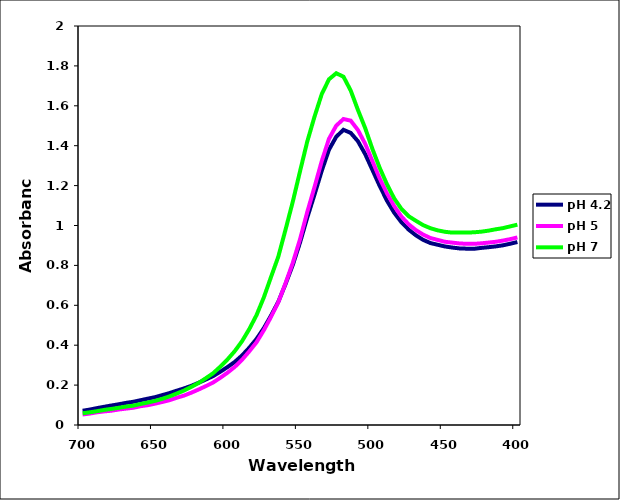
| Category | pH 4.2 | pH 5 | pH 7 |
|---|---|---|---|
| 700.0673218 | 0.071 | 0.053 | 0.059 |
| 695.0328369 | 0.077 | 0.057 | 0.064 |
| 689.9901123 | 0.085 | 0.064 | 0.069 |
| 684.93927 | 0.091 | 0.068 | 0.076 |
| 680.0249634 | 0.098 | 0.072 | 0.081 |
| 674.958252 | 0.104 | 0.078 | 0.086 |
| 670.0286865 | 0.111 | 0.082 | 0.093 |
| 664.9462891 | 0.116 | 0.086 | 0.097 |
| 660.0015869 | 0.124 | 0.094 | 0.105 |
| 655.0495605 | 0.132 | 0.099 | 0.113 |
| 649.9442139 | 0.14 | 0.107 | 0.121 |
| 644.977417 | 0.15 | 0.115 | 0.131 |
| 640.003418 | 0.16 | 0.124 | 0.144 |
| 635.0223389 | 0.172 | 0.137 | 0.158 |
| 630.0341187 | 0.183 | 0.147 | 0.173 |
| 625.0389404 | 0.196 | 0.162 | 0.191 |
| 620.0368042 | 0.211 | 0.178 | 0.211 |
| 615.02771 | 0.228 | 0.195 | 0.234 |
| 610.0117798 | 0.245 | 0.213 | 0.259 |
| 604.9890747 | 0.267 | 0.237 | 0.292 |
| 599.9595947 | 0.291 | 0.262 | 0.329 |
| 595.0716553 | 0.316 | 0.291 | 0.37 |
| 590.0290527 | 0.348 | 0.327 | 0.42 |
| 584.9799194 | 0.387 | 0.369 | 0.481 |
| 580.0730591 | 0.431 | 0.415 | 0.551 |
| 575.0111084 | 0.485 | 0.474 | 0.639 |
| 569.942749 | 0.549 | 0.542 | 0.742 |
| 565.017395 | 0.617 | 0.615 | 0.843 |
| 559.9365845 | 0.706 | 0.71 | 0.979 |
| 554.9992676 | 0.802 | 0.812 | 1.119 |
| 550.0560913 | 0.914 | 0.931 | 1.271 |
| 544.9571533 | 1.039 | 1.067 | 1.421 |
| 540.0023193 | 1.155 | 1.192 | 1.545 |
| 535.0418091 | 1.274 | 1.322 | 1.658 |
| 529.9251099 | 1.38 | 1.435 | 1.733 |
| 524.9533081 | 1.445 | 1.5 | 1.763 |
| 519.9759521 | 1.48 | 1.534 | 1.746 |
| 514.9931641 | 1.464 | 1.526 | 1.676 |
| 510.0049438 | 1.422 | 1.478 | 1.579 |
| 505.0113831 | 1.358 | 1.409 | 1.488 |
| 500.0125122 | 1.278 | 1.323 | 1.383 |
| 495.0083923 | 1.198 | 1.236 | 1.289 |
| 489.999115 | 1.125 | 1.161 | 1.207 |
| 484.9846497 | 1.064 | 1.098 | 1.136 |
| 479.9651184 | 1.016 | 1.045 | 1.083 |
| 474.9405518 | 0.979 | 1.006 | 1.047 |
| 470.0634766 | 0.951 | 0.977 | 1.023 |
| 465.0291443 | 0.928 | 0.954 | 1.002 |
| 459.9899292 | 0.912 | 0.937 | 0.986 |
| 454.9458923 | 0.903 | 0.928 | 0.976 |
| 450.0501099 | 0.895 | 0.918 | 0.968 |
| 444.9967346 | 0.889 | 0.914 | 0.964 |
| 439.9386597 | 0.885 | 0.91 | 0.965 |
| 435.0294495 | 0.884 | 0.908 | 0.965 |
| 429.9623413 | 0.883 | 0.908 | 0.966 |
| 425.0444641 | 0.888 | 0.911 | 0.969 |
| 419.9685364 | 0.891 | 0.914 | 0.974 |
| 415.0421753 | 0.895 | 0.918 | 0.981 |
| 409.9576111 | 0.901 | 0.924 | 0.987 |
| 405.0230103 | 0.909 | 0.931 | 0.996 |
| 399.9299927 | 0.917 | 0.94 | 1.004 |